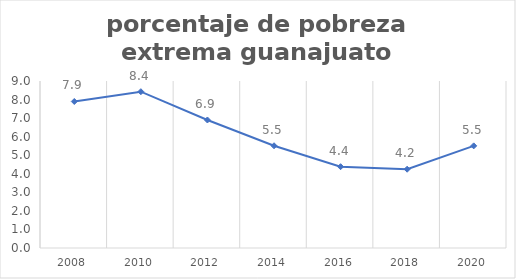
| Category | Series 0 |
|---|---|
| 2008.0 | 7.897 |
| 2010.0 | 8.424 |
| 2012.0 | 6.898 |
| 2014.0 | 5.51 |
| 2016.0 | 4.382 |
| 2018.0 | 4.246 |
| 2020.0 | 5.504 |